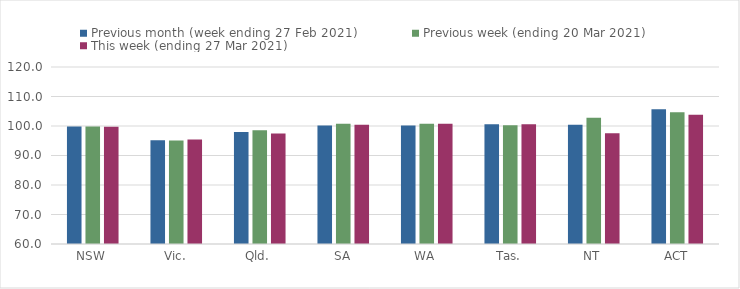
| Category | Previous month (week ending 27 Feb 2021) | Previous week (ending 20 Mar 2021) | This week (ending 27 Mar 2021) |
|---|---|---|---|
| NSW | 99.86 | 99.87 | 99.75 |
| Vic. | 95.16 | 95.07 | 95.44 |
| Qld. | 97.93 | 98.55 | 97.43 |
| SA | 100.15 | 100.76 | 100.39 |
| WA | 100.18 | 100.77 | 100.79 |
| Tas. | 100.57 | 100.29 | 100.57 |
| NT | 100.42 | 102.81 | 97.54 |
| ACT | 105.72 | 104.64 | 103.84 |